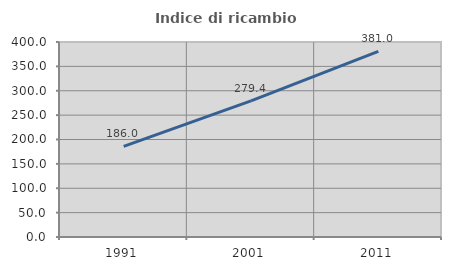
| Category | Indice di ricambio occupazionale  |
|---|---|
| 1991.0 | 185.992 |
| 2001.0 | 279.375 |
| 2011.0 | 380.952 |